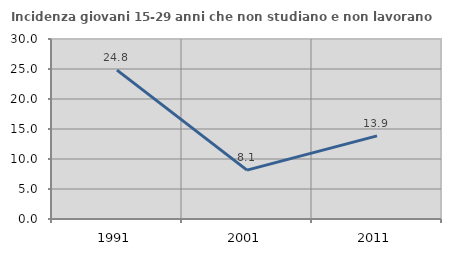
| Category | Incidenza giovani 15-29 anni che non studiano e non lavorano  |
|---|---|
| 1991.0 | 24.823 |
| 2001.0 | 8.148 |
| 2011.0 | 13.861 |